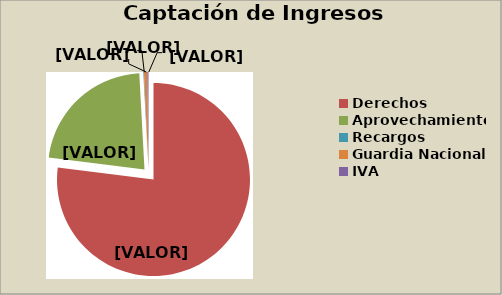
| Category | 13  Ingresos Directos a la Federación  |
|---|---|
| Derechos | 77.033 |
| Productos | 0.001 |
| Aprovechamientos | 22.157 |
| Actualizaciones | 0.011 |
| Recargos | 0.1 |
| Guardia Nacional | 0.543 |
| IVA | 0.212 |